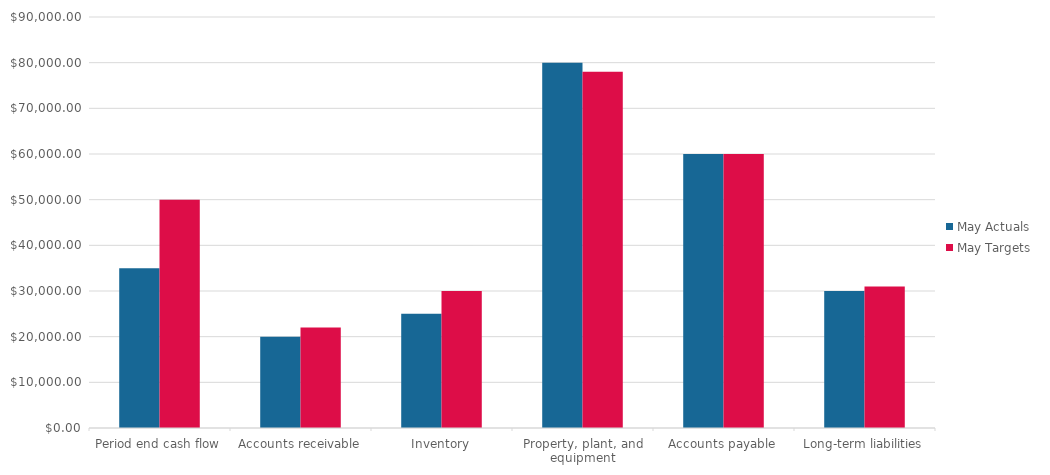
| Category | May Actuals | May Targets |
|---|---|---|
| Period end cash flow | 35000 | 50000 |
| Accounts receivable | 20000 | 22000 |
| Inventory | 25000 | 30000 |
| Property, plant, and equipment | 80000 | 78000 |
| Accounts payable | 60000 | 60000 |
| Long-term liabilities | 30000 | 31000 |